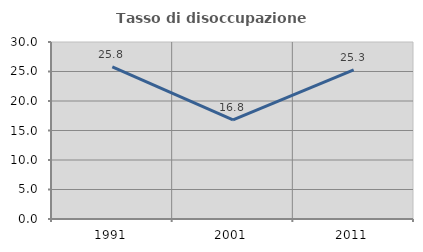
| Category | Tasso di disoccupazione giovanile  |
|---|---|
| 1991.0 | 25.764 |
| 2001.0 | 16.807 |
| 2011.0 | 25.287 |